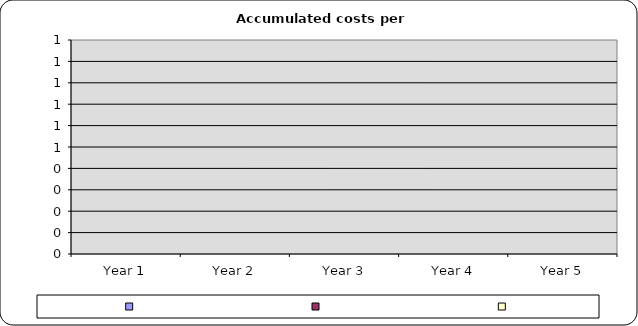
| Category | Series 0 | Series 1 | Series 2 |
|---|---|---|---|
| Year 1 | 0 | 0 | 0 |
| Year 2 | 0 | 0 | 0 |
| Year 3 | 0 | 0 | 0 |
| Year 4 | 0 | 0 | 0 |
| Year 5 | 0 | 0 | 0 |